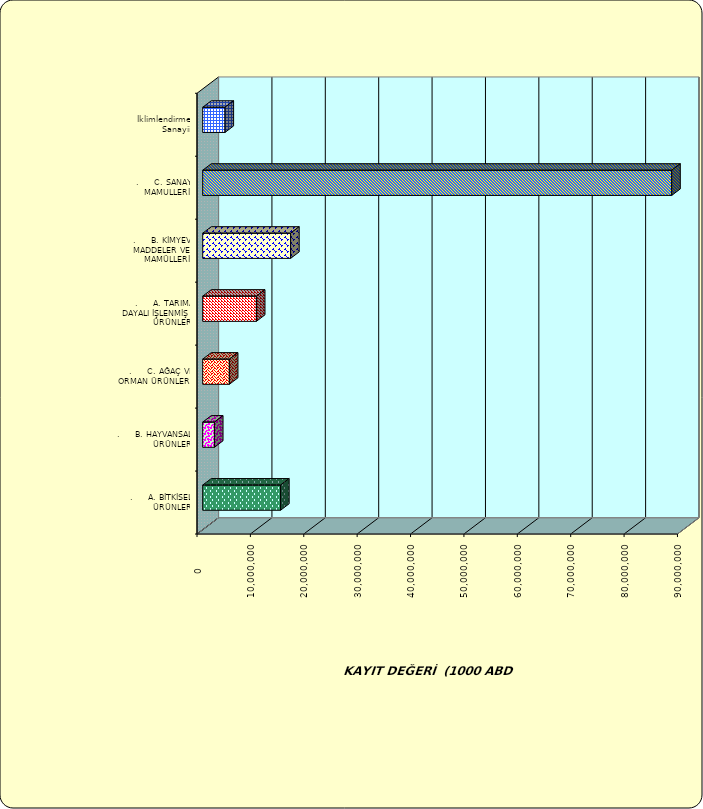
| Category | Series 0 |
|---|---|
| .     A. BİTKİSEL ÜRÜNLER | 14583819.852 |
| .     B. HAYVANSAL ÜRÜNLER | 2196996.661 |
| .     C. AĞAÇ VE ORMAN ÜRÜNLERİ | 4992845.582 |
| .     A. TARIMA DAYALI İŞLENMİŞ ÜRÜNLER | 10057196.616 |
| .     B. KİMYEVİ MADDELER VE MAMÜLLERİ | 16465972.782 |
| .     C. SANAYİ MAMULLERİ | 87856482.313 |
|  İklimlendirme Sanayii | 4176674.934 |